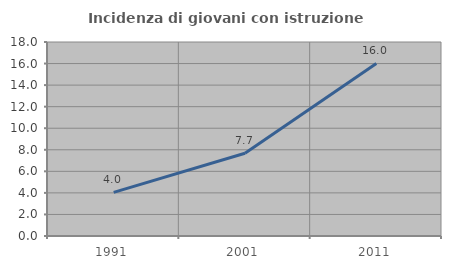
| Category | Incidenza di giovani con istruzione universitaria |
|---|---|
| 1991.0 | 4.045 |
| 2001.0 | 7.675 |
| 2011.0 | 16.01 |